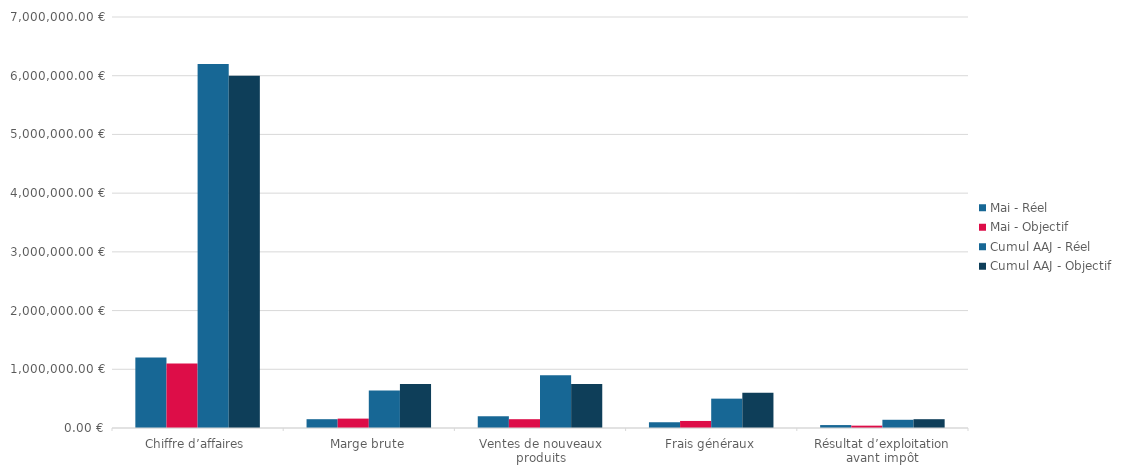
| Category | Mai - Réel | Mai - Objectif | Cumul AAJ - Réel | Cumul AAJ - Objectif |
|---|---|---|---|---|
| Chiffre d’affaires | 1200000 | 1100000 | 6200000 | 6000000 |
| Marge brute | 150000 | 160000 | 640000 | 750000 |
| Ventes de nouveaux produits | 200000 | 150000 | 900000 | 750000 |
| Frais généraux | 100000 | 120000 | 500000 | 600000 |
| Résultat d’exploitation avant impôt | 50000 | 40000 | 140000 | 150000 |